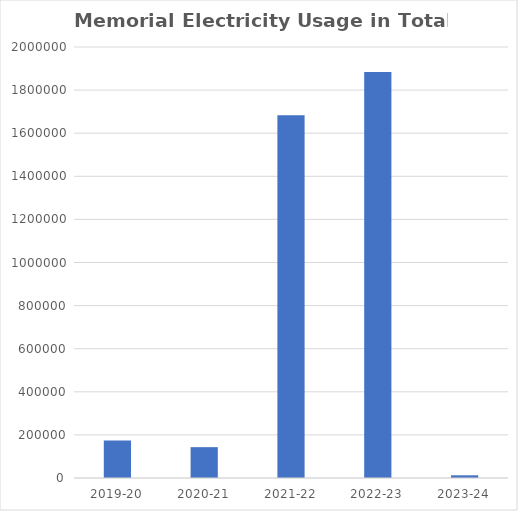
| Category | Series 0 |
|---|---|
| 0 | 174426 |
| 1 | 143123 |
| 2 | 1683763 |
| 3 | 1884339 |
| 4 | 12520 |